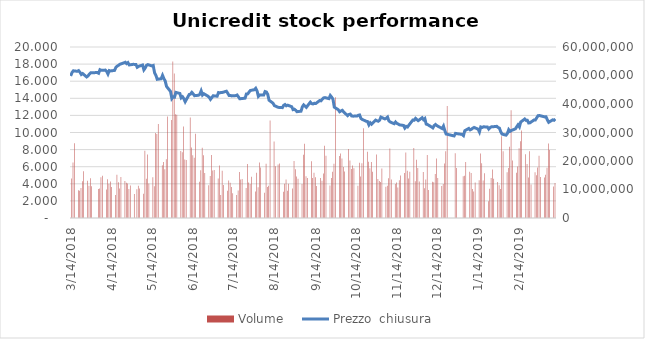
| Category | Volume   |
|---|---|
| 0 | 13827639 |
| 1/1/00 | 19477795 |
| 1/2/00 | 26185731 |
| 1/3/00 | 9766414 |
| 1/4/00 | 9592130 |
| 1/5/00 | 10559545 |
| 1/6/00 | 12873751 |
| 1/7/00 | 16370558 |
| 1/8/00 | 13047701 |
| 1/9/00 | 11315553 |
| 1/10/00 | 13906790 |
| 1/11/00 | 11132106 |
| 1/12/00 | 10158394 |
| 1/13/00 | 10358919 |
| 1/14/00 | 14308907 |
| 1/15/00 | 14787297 |
| 1/16/00 | 10027425 |
| 1/17/00 | 13624348 |
| 1/18/00 | 11979435 |
| 1/19/00 | 12838310 |
| 1/20/00 | 10890247 |
| 1/21/00 | 8098905 |
| 1/22/00 | 15189513 |
| 1/23/00 | 12529563 |
| 1/24/00 | 10385504 |
| 1/25/00 | 14374012 |
| 1/26/00 | 13009064 |
| 1/27/00 | 12332694 |
| 1/28/00 | 12087562 |
| 1/29/00 | 10191326 |
| 1/30/00 | 11399587 |
| 1/31/00 | 8441092 |
| 2/1/00 | 10058475 |
| 2/2/00 | 11355662 |
| 2/3/00 | 10356460 |
| 2/4/00 | 8533985 |
| 2/5/00 | 23618163 |
| 2/6/00 | 13792020 |
| 2/7/00 | 22298304 |
| 2/8/00 | 12139735 |
| 2/9/00 | 14325872 |
| 2/10/00 | 11167969 |
| 2/11/00 | 29866566 |
| 2/12/00 | 29515698 |
| 2/13/00 | 32974334 |
| 2/14/00 | 18479080 |
| 2/15/00 | 19659900 |
| 2/16/00 | 17133714 |
| 2/17/00 | 20656347 |
| 2/18/00 | 35570986 |
| 2/19/00 | 34342472 |
| 2/20/00 | 54904157 |
| 2/21/00 | 50663773 |
| 2/22/00 | 36415268 |
| 2/23/00 | 36245306 |
| 2/24/00 | 23496234 |
| 2/25/00 | 23027228 |
| 2/26/00 | 32072168 |
| 2/27/00 | 20525417 |
| 2/28/00 | 20372466 |
| 2/28/00 | 35244243 |
| 3/1/00 | 24775613 |
| 3/2/00 | 22016199 |
| 3/3/00 | 21172993 |
| 3/4/00 | 29586236 |
| 3/5/00 | 12740203 |
| 3/6/00 | 16763069 |
| 3/7/00 | 24638225 |
| 3/8/00 | 22017646 |
| 3/9/00 | 15810219 |
| 3/10/00 | 11534134 |
| 3/11/00 | 14769280 |
| 3/12/00 | 22079558 |
| 3/13/00 | 16626231 |
| 3/14/00 | 16872613 |
| 3/15/00 | 13849548 |
| 3/16/00 | 18436866 |
| 3/17/00 | 8062771 |
| 3/18/00 | 16591532 |
| 3/19/00 | 11558040 |
| 3/20/00 | 9545167 |
| 3/21/00 | 13139191 |
| 3/22/00 | 12347326 |
| 3/23/00 | 10864991 |
| 3/24/00 | 8696164 |
| 3/25/00 | 8029707 |
| 3/26/00 | 9681311 |
| 3/27/00 | 16130503 |
| 3/28/00 | 13474585 |
| 3/29/00 | 13648572 |
| 3/30/00 | 10522380 |
| 3/31/00 | 18914295 |
| 4/1/00 | 12460870 |
| 4/2/00 | 11892030 |
| 4/3/00 | 14439379 |
| 4/4/00 | 9260960 |
| 4/5/00 | 15847298 |
| 4/6/00 | 10810265 |
| 4/7/00 | 19435995 |
| 4/8/00 | 17712061 |
| 4/9/00 | 8881027 |
| 4/10/00 | 19043424 |
| 4/11/00 | 10848826 |
| 4/12/00 | 11301577 |
| 4/13/00 | 34166954 |
| 4/14/00 | 26852525 |
| 4/15/00 | 18126605 |
| 4/16/00 | 18795229 |
| 4/17/00 | 19095972 |
| 4/18/00 | 9249463 |
| 4/19/00 | 12049559 |
| 4/20/00 | 13490768 |
| 4/21/00 | 9588554 |
| 4/22/00 | 12042510 |
| 4/23/00 | 10375778 |
| 4/24/00 | 19978949 |
| 4/25/00 | 17088945 |
| 4/26/00 | 14551469 |
| 4/27/00 | 13785798 |
| 4/28/00 | 11950881 |
| 4/29/00 | 22200111 |
| 4/30/00 | 26021463 |
| 5/1/00 | 14675230 |
| 5/2/00 | 14059833 |
| 5/3/00 | 19909950 |
| 5/4/00 | 14045100 |
| 5/5/00 | 15844686 |
| 5/6/00 | 14340676 |
| 5/7/00 | 11254701 |
| 5/8/00 | 14040642 |
| 5/9/00 | 13074564 |
| 5/10/00 | 15582391 |
| 5/11/00 | 25392740 |
| 5/12/00 | 21866376 |
| 5/13/00 | 11446061 |
| 5/14/00 | 14051153 |
| 5/15/00 | 16249308 |
| 5/16/00 | 19017354 |
| 5/17/00 | 42389440 |
| 5/18/00 | 21715113 |
| 5/19/00 | 22607803 |
| 5/20/00 | 20909463 |
| 5/21/00 | 17914014 |
| 5/22/00 | 16342878 |
| 5/23/00 | 24227640 |
| 5/24/00 | 20216087 |
| 5/25/00 | 17233972 |
| 5/26/00 | 18454291 |
| 5/27/00 | 17414234 |
| 5/28/00 | 11306845 |
| 5/29/00 | 19355835 |
| 5/30/00 | 14587282 |
| 5/31/00 | 19187247 |
| 6/1/00 | 31476683 |
| 6/2/00 | 23231267 |
| 6/3/00 | 19715355 |
| 6/4/00 | 17477491 |
| 6/5/00 | 19682250 |
| 6/6/00 | 16209424 |
| 6/7/00 | 22314749 |
| 6/8/00 | 13702748 |
| 6/9/00 | 13021085 |
| 6/10/00 | 12605551 |
| 6/11/00 | 17381434 |
| 6/12/00 | 10968029 |
| 6/13/00 | 11281566 |
| 6/14/00 | 13912139 |
| 6/15/00 | 24359334 |
| 6/16/00 | 13473804 |
| 6/17/00 | 11959660 |
| 6/18/00 | 12422488 |
| 6/19/00 | 10739299 |
| 6/20/00 | 13259083 |
| 6/21/00 | 14936668 |
| 6/22/00 | 15760819 |
| 6/23/00 | 22979987 |
| 6/24/00 | 16599281 |
| 6/25/00 | 13871749 |
| 6/26/00 | 16248614 |
| 6/27/00 | 24521359 |
| 6/28/00 | 12924510 |
| 6/29/00 | 20472911 |
| 6/30/00 | 17567910 |
| 7/1/00 | 12825215 |
| 7/2/00 | 16114739 |
| 7/3/00 | 10421166 |
| 7/4/00 | 13517916 |
| 7/5/00 | 22067449 |
| 7/6/00 | 9845429 |
| 7/7/00 | 12679706 |
| 7/8/00 | 12529611 |
| 7/9/00 | 15443075 |
| 7/10/00 | 20916252 |
| 7/11/00 | 14032220 |
| 7/12/00 | 11210854 |
| 7/13/00 | 11905889 |
| 7/14/00 | 19081611 |
| 7/15/00 | 23381007 |
| 7/16/00 | 39256417 |
| 7/17/00 | 22717810 |
| 7/18/00 | 17533176 |
| 7/19/00 | 14685103 |
| 7/20/00 | 14785276 |
| 7/21/00 | 19679549 |
| 7/22/00 | 16259734 |
| 7/23/00 | 15749741 |
| 7/24/00 | 10196238 |
| 7/25/00 | 9299781 |
| 7/26/00 | 12459808 |
| 7/27/00 | 13228685 |
| 7/28/00 | 22661693 |
| 7/29/00 | 19194299 |
| 7/30/00 | 13119402 |
| 7/31/00 | 15699522 |
| 8/1/00 | 5896736 |
| 8/2/00 | 10286292 |
| 8/3/00 | 14044109 |
| 8/4/00 | 16993103 |
| 8/5/00 | 13768178 |
| 8/6/00 | 12604460 |
| 8/7/00 | 11477620 |
| 8/8/00 | 10145051 |
| 8/9/00 | 28692543 |
| 8/10/00 | 23391283 |
| 8/11/00 | 16033629 |
| 8/12/00 | 17518477 |
| 8/13/00 | 25032213 |
| 8/14/00 | 37838682 |
| 8/15/00 | 20190981 |
| 8/16/00 | 15862498 |
| 8/17/00 | 18067140 |
| 8/18/00 | 24477128 |
| 8/19/00 | 26888582 |
| 8/20/00 | 30674424 |
| 8/21/00 | 22372059 |
| 8/22/00 | 18967322 |
| 8/23/00 | 14189164 |
| 8/24/00 | 23381921 |
| 8/25/00 | 11732543 |
| 8/26/00 | 16027148 |
| 8/27/00 | 15035080 |
| 8/28/00 | 17707911 |
| 8/29/00 | 21860772 |
| 8/30/00 | 14422911 |
| 8/31/00 | 14236666 |
| 9/1/00 | 15219151 |
| 9/2/00 | 17632504 |
| 9/3/00 | 26158814 |
| 9/4/00 | 23854569 |
| 9/5/00 | 11082538 |
| 9/6/00 | 12280818 |
| 9/7/00 | 9299641 |